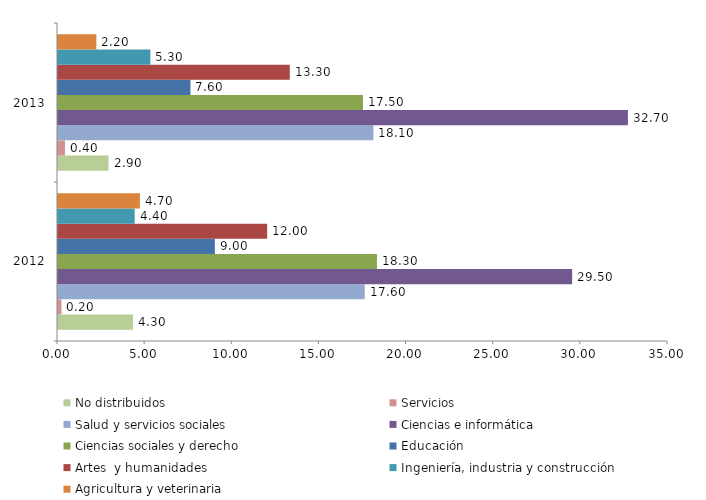
| Category | No distribuidos | Servicios | Salud y servicios sociales | Ciencias e informática | Ciencias sociales y derecho | Educación | Artes  y humanidades | Ingeniería, industria y construcción | Agricultura y veterinaria |
|---|---|---|---|---|---|---|---|---|---|
| 0 | 4.3 | 0.2 | 17.6 | 29.5 | 18.3 | 9 | 12 | 4.4 | 4.7 |
| 1 | 2.9 | 0.4 | 18.1 | 32.7 | 17.5 | 7.6 | 13.3 | 5.3 | 2.2 |